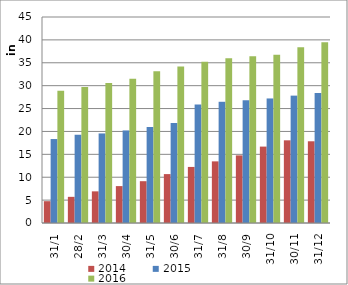
| Category | 2014 | 2015 | 2016 |
|---|---|---|---|
| 31/1 | 4765 | 18341 | 28886 |
| 28/2 | 5714 | 19278 | 29684 |
| 31/3 | 6914 | 19564 | 30602 |
| 30/4 | 8061 | 20217 | 31534 |
| 31/5 | 9132 | 20970 | 33168 |
| 30/6 | 10683 | 21843 | 34200 |
| 31/7 | 12248 | 25885 | 35239 |
| 31/8 | 13464 | 26480 | 35983 |
| 30/9 | 14770 | 26811 | 36419 |
| 31/10 | 16691 | 27205 | 36774 |
| 30/11 | 18062 | 27824 | 38396 |
| 31/12 | 17851 | 28407 | 39458 |